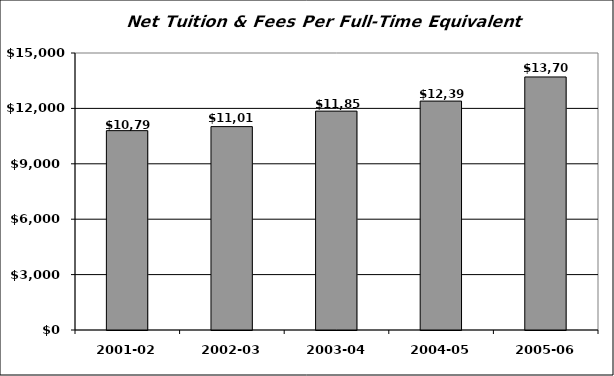
| Category | Equivalent Student |
|---|---|
| 2001-02 | 10794.792 |
| 2002-03 | 11013.643 |
| 2003-04 | 11853.094 |
| 2004-05 | 12396.387 |
| 2005-06 | 13702.361 |